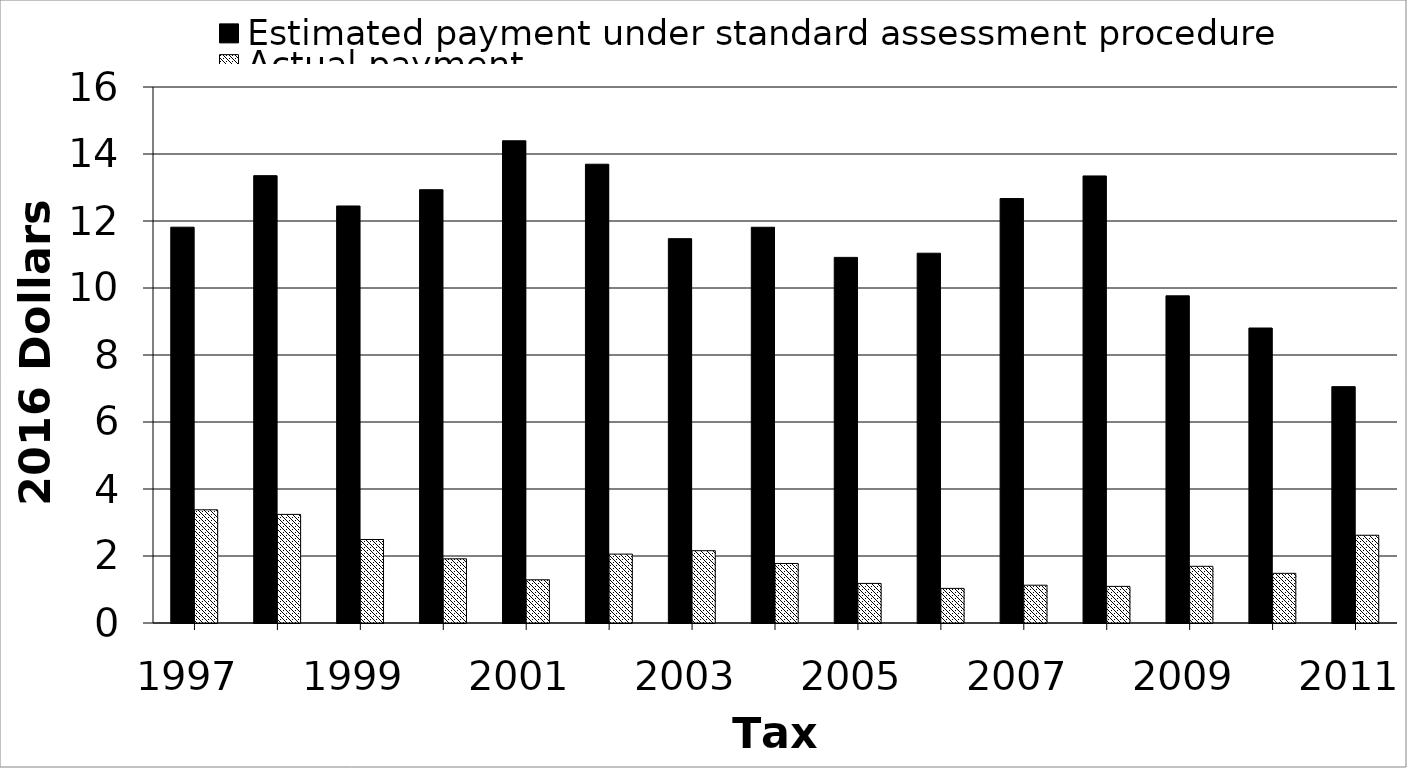
| Category | Estimated payment under standard assessment procedure | Actual payment |
|---|---|---|
| 1997.0 | 11815510.525 | 3378886.215 |
| 1998.0 | 13353446.567 | 3241697.962 |
| 1999.0 | 12448469.077 | 2492176.412 |
| 2000.0 | 12933940.294 | 1916093.953 |
| 2001.0 | 14394917.65 | 1289685.5 |
| 2002.0 | 13695304.173 | 2056637.731 |
| 2003.0 | 11472884.676 | 2158993.292 |
| 2004.0 | 11813260.685 | 1777015.12 |
| 2005.0 | 10913827.342 | 1181884.82 |
| 2006.0 | 11038587.946 | 1033521.815 |
| 2007.0 | 12670273.615 | 1127922.273 |
| 2008.0 | 13344850.484 | 1093139.694 |
| 2009.0 | 9766501.785 | 1692625.37 |
| 2010.0 | 8805785.774 | 1482451.918 |
| 2011.0 | 7055536.005 | 2619800.83 |